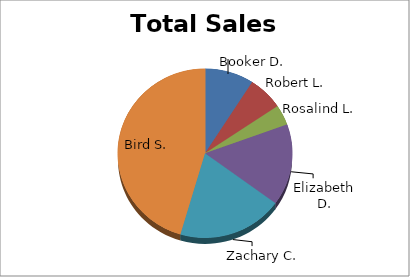
| Category | Quantity |
|---|---|
| Booker D. | 7 |
| Robert L. | 5 |
| Rosalind L. | 3 |
| Elizabeth D. | 12 |
| Zachary C. | 15 |
| Bird S. | 35 |